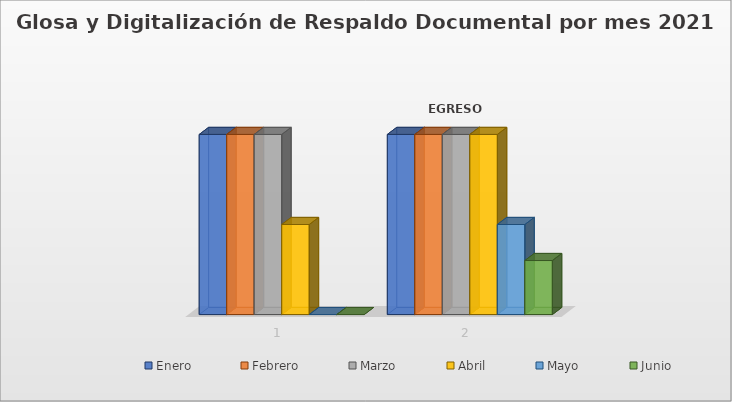
| Category | Enero | Febrero | Marzo | Abril | Mayo | Junio |
|---|---|---|---|---|---|---|
| 0 | 1 | 1 | 1 | 0.5 | 0 | 0 |
| 1 | 1 | 1 | 1 | 1 | 0.5 | 0.3 |